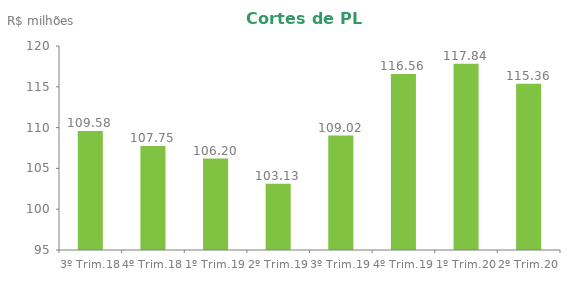
| Category | Series 0 |
|---|---|
| 3º Trim.18 | 109.58 |
| 4º Trim.18 | 107.752 |
| 1º Trim.19 | 106.202 |
| 2º Trim.19 | 103.131 |
| 3º Trim.19 | 109.023 |
| 4º Trim.19 | 116.56 |
| 1º Trim.20 | 117.839 |
| 2º Trim.20 | 115.362 |